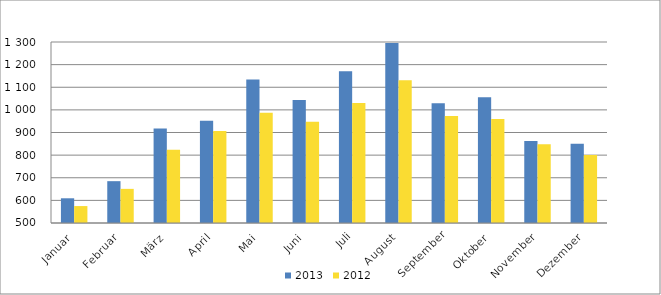
| Category | 2013 | 2012 |
|---|---|---|
| Januar | 609221 | 574875 |
| Februar | 684879 | 650853 |
| März | 917650 | 824304 |
| April | 951942 | 906720 |
| Mai | 1133919 | 986851 |
| Juni | 1043110 | 947650 |
| Juli | 1170467 | 1029932 |
| August | 1295224 | 1130862 |
| September | 1028739 | 972883 |
| Oktober | 1055314 | 959793 |
| November | 862235 | 848345 |
| Dezember | 850435 | 800944 |